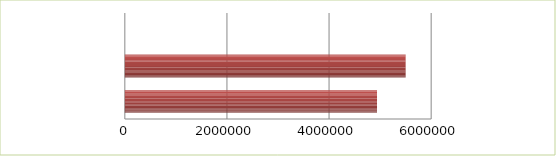
| Category | Series 0 | Series 1 |
|---|---|---|
| 0 | 2.5 | 4939461.56 |
| 1 | 2.6 | 5500000 |
| 2 | 2.7 | 0 |